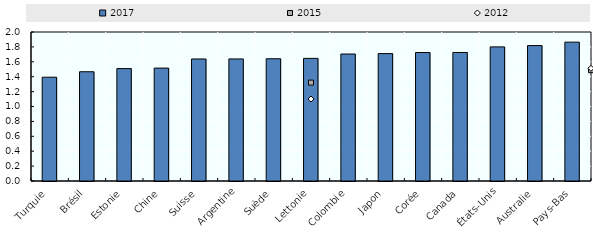
| Category | 2017 |
|---|---|
| Turquie | 1.393 |
| Brésil | 1.467 |
| Estonie | 1.509 |
| Chine | 1.515 |
| Suisse | 1.638 |
| Argentine | 1.638 |
| Suède | 1.641 |
| Lettonie | 1.646 |
| Colombie | 1.704 |
| Japon | 1.71 |
| Corée | 1.725 |
| Canada | 1.725 |
| États-Unis | 1.8 |
| Australie | 1.818 |
| Pays-Bas | 1.864 |